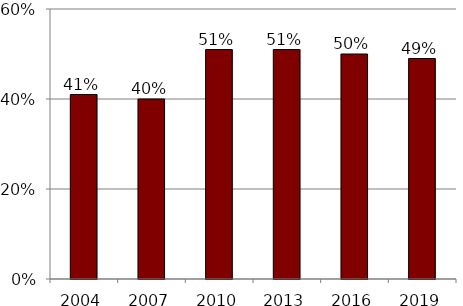
| Category | Series 0 |
|---|---|
| 2004.0 | 0.41 |
| 2007.0 | 0.4 |
| 2010.0 | 0.51 |
| 2013.0 | 0.51 |
| 2016.0 | 0.5 |
| 2019.0 | 0.49 |